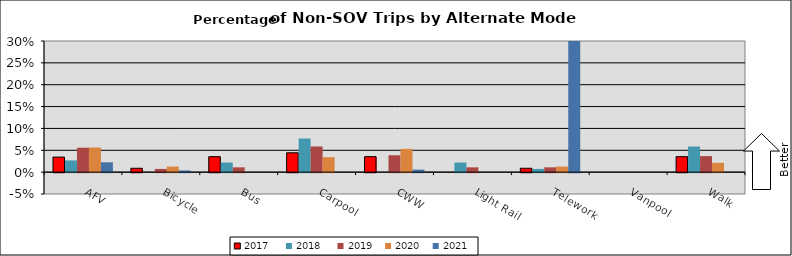
| Category | 2017 | 2018 | 2019 | 2020 | 2021 |
|---|---|---|---|---|---|
| AFV | 0.034 | 0.027 | 0.056 | 0.056 | 0.023 |
| Bicycle | 0.009 | 0 | 0.007 | 0.013 | 0.004 |
| Bus | 0.035 | 0.022 | 0.011 | 0 | 0 |
| Carpool | 0.044 | 0.077 | 0.059 | 0.034 | 0 |
| CWW | 0.035 | 0 | 0.039 | 0.053 | 0.006 |
| Light Rail | 0 | 0.022 | 0.011 | 0 | 0 |
| Telework | 0.009 | 0.007 | 0.011 | 0.013 | 0.702 |
| Vanpool | 0 | 0 | 0 | 0 | 0 |
| Walk | 0.035 | 0.059 | 0.037 | 0.021 | 0 |